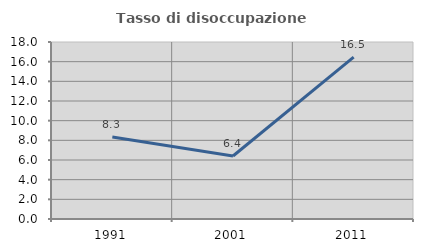
| Category | Tasso di disoccupazione giovanile  |
|---|---|
| 1991.0 | 8.333 |
| 2001.0 | 6.41 |
| 2011.0 | 16.471 |